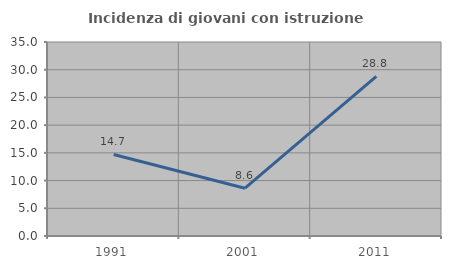
| Category | Incidenza di giovani con istruzione universitaria |
|---|---|
| 1991.0 | 14.706 |
| 2001.0 | 8.621 |
| 2011.0 | 28.788 |